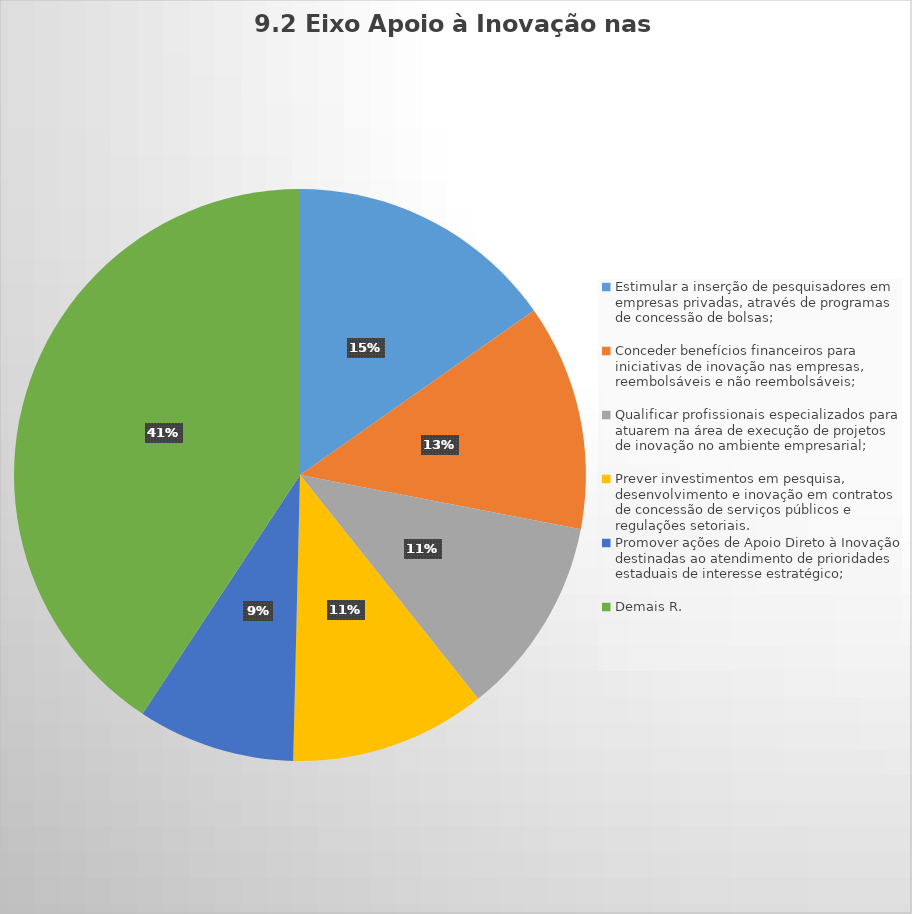
| Category | Series 0 |
|---|---|
| Estimular a inserção de pesquisadores em empresas privadas, através de programas de concessão de bolsas; | 161 |
| Conceder benefícios financeiros para iniciativas de inovação nas empresas, reembolsáveis e não reembolsáveis; | 135 |
| Qualificar profissionais especializados para atuarem na área de execução de projetos de inovação no ambiente empresarial; | 119 |
| Prever investimentos em pesquisa, desenvolvimento e inovação em contratos de concessão de serviços públicos e regulações setoriais. | 117 |
| Promover ações de Apoio Direto à Inovação destinadas ao atendimento de prioridades estaduais de interesse estratégico; | 94 |
| Demais R. | 430 |